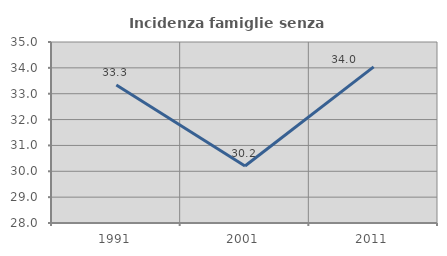
| Category | Incidenza famiglie senza nuclei |
|---|---|
| 1991.0 | 33.333 |
| 2001.0 | 30.203 |
| 2011.0 | 34.039 |